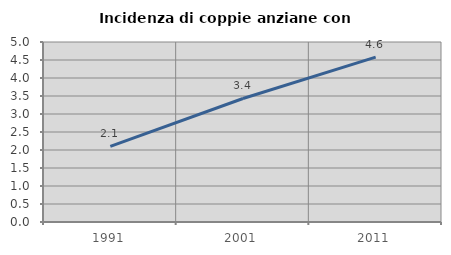
| Category | Incidenza di coppie anziane con figli |
|---|---|
| 1991.0 | 2.101 |
| 2001.0 | 3.431 |
| 2011.0 | 4.579 |